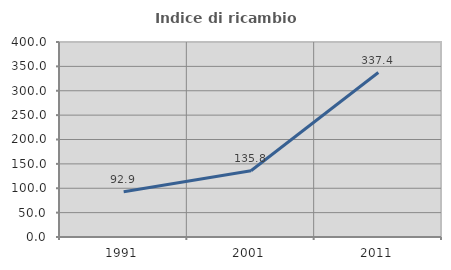
| Category | Indice di ricambio occupazionale  |
|---|---|
| 1991.0 | 92.872 |
| 2001.0 | 135.835 |
| 2011.0 | 337.405 |